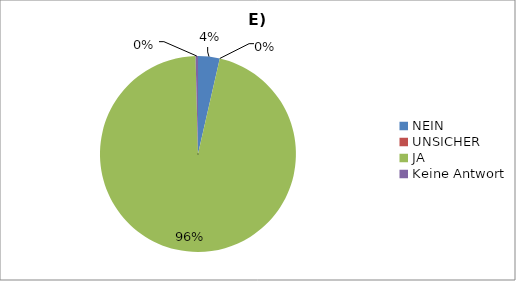
| Category | Series 0 |
|---|---|
| NEIN | 9 |
| UNSICHER | 0 |
| JA | 242 |
| Keine Antwort | 1 |